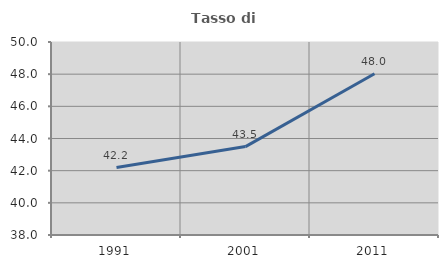
| Category | Tasso di occupazione   |
|---|---|
| 1991.0 | 42.193 |
| 2001.0 | 43.497 |
| 2011.0 | 48.028 |